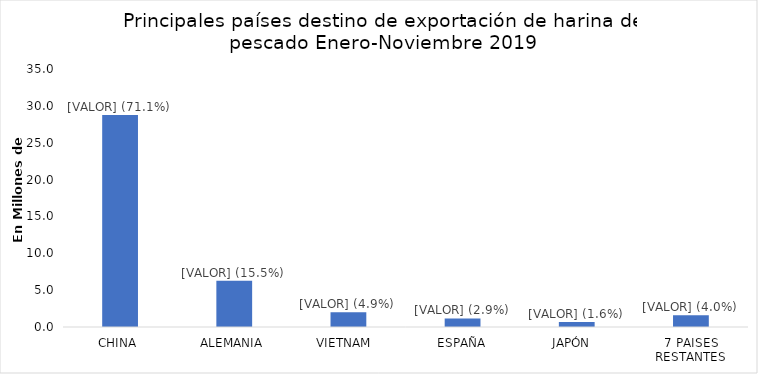
| Category | Series 0 |
|---|---|
| CHINA  | 28755504 |
| ALEMANIA  | 6270184 |
| VIETNAM   | 1997320 |
| ESPAÑA | 1163555 |
| JAPÓN   | 663360 |
| 7 PAISES RESTANTES | 1609455 |